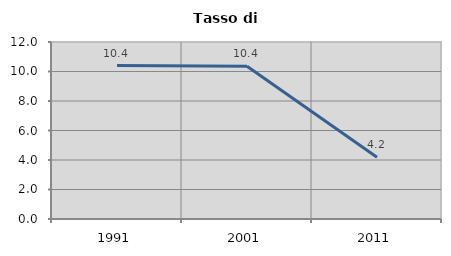
| Category | Tasso di disoccupazione   |
|---|---|
| 1991.0 | 10.4 |
| 2001.0 | 10.363 |
| 2011.0 | 4.18 |